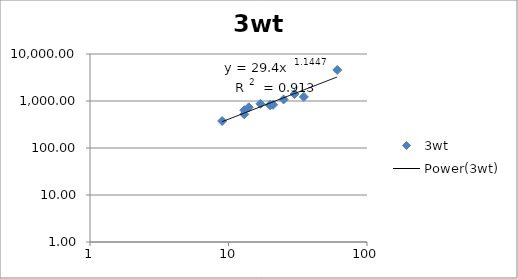
| Category | 3wt |
|---|---|
| 61.0 | 4571.92 |
| 35.0 | 1223.42 |
| 30.0 | 1407.36 |
| 25.0 | 1078.19 |
| 21.0 | 830.77 |
| 20.0 | 806.97 |
| 20.0 | 833.55 |
| 17.0 | 871.45 |
| 14.0 | 733.7 |
| 13.0 | 521.49 |
| 13.0 | 638.4 |
| 9.0 | 375.07 |